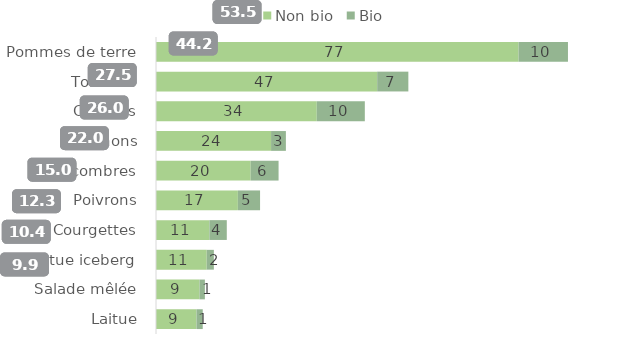
| Category | Non bio | Bio |
|---|---|---|
| Pommes de terre | 76.808 | 10.472 |
| Tomates | 46.86 | 6.607 |
| Carottes | 34.064 | 10.178 |
| Oignons | 24.376 | 3.141 |
| Concombres | 20.06 | 5.909 |
| Poivrons | 17.346 | 4.701 |
| Courgettes | 11.312 | 3.685 |
| Laitue iceberg | 10.745 | 1.513 |
| Salade mêlée | 9.216 | 1.139 |
| Laitue | 8.57 | 1.334 |